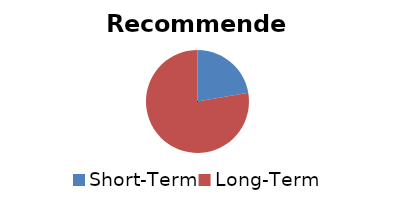
| Category | Series 0 |
|---|---|
| Short-Term | 0.223 |
| Long-Term | 0.777 |